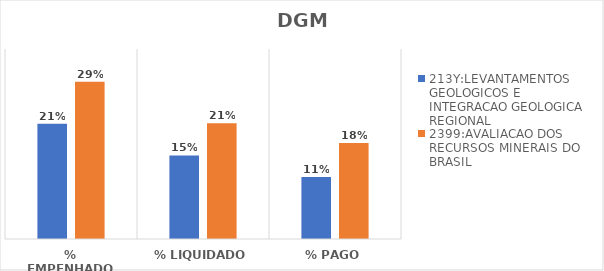
| Category | 213Y:LEVANTAMENTOS GEOLOGICOS E INTEGRACAO GEOLOGICA REGIONAL | 2399:AVALIACAO DOS RECURSOS MINERAIS DO BRASIL |
|---|---|---|
| % EMPENHADO | 0.212 | 0.29 |
| % LIQUIDADO | 0.154 | 0.213 |
| % PAGO | 0.114 | 0.177 |